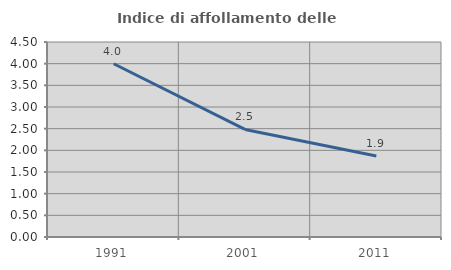
| Category | Indice di affollamento delle abitazioni  |
|---|---|
| 1991.0 | 3.997 |
| 2001.0 | 2.483 |
| 2011.0 | 1.87 |